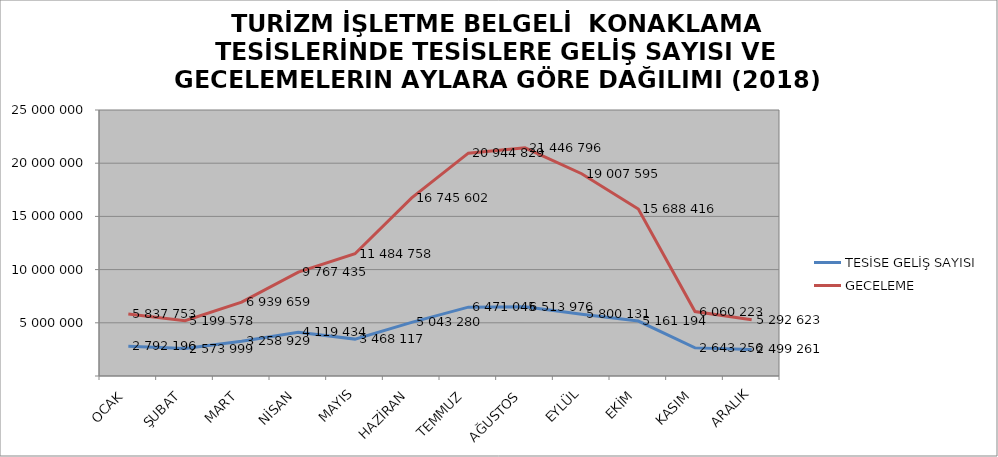
| Category | TESİSE GELİŞ SAYISI | GECELEME |
|---|---|---|
| OCAK | 2792196 | 5837753 |
| ŞUBAT | 2573999 | 5199578 |
| MART | 3258929 | 6939659 |
| NİSAN | 4119434 | 9767435 |
| MAYIS | 3468117 | 11484758 |
| HAZİRAN | 5043280 | 16745602 |
| TEMMUZ | 6471045 | 20944829 |
| AĞUSTOS | 6513976 | 21446796 |
| EYLÜL | 5800131 | 19007595 |
| EKİM | 5161194 | 15688416 |
| KASIM | 2643256 | 6060223 |
| ARALIK | 2499261 | 5292623 |